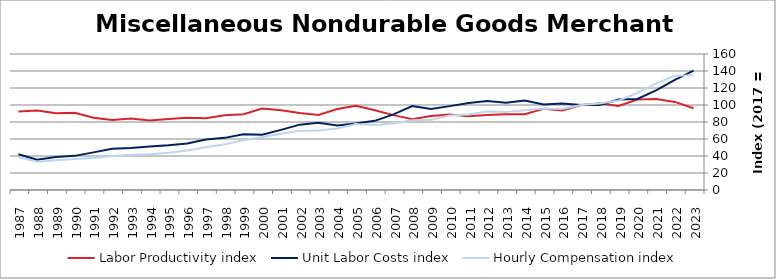
| Category | Labor Productivity index | Unit Labor Costs index | Hourly Compensation index |
|---|---|---|---|
| 2023.0 | 96.221 | 140.354 | 135.05 |
| 2022.0 | 103.648 | 129.61 | 134.338 |
| 2021.0 | 107.048 | 117.242 | 125.505 |
| 2020.0 | 106.496 | 107.169 | 114.13 |
| 2019.0 | 98.769 | 106.506 | 105.195 |
| 2018.0 | 101.631 | 100.028 | 101.66 |
| 2017.0 | 100 | 100 | 100 |
| 2016.0 | 93.65 | 101.788 | 95.324 |
| 2015.0 | 95.463 | 100.524 | 95.964 |
| 2014.0 | 89.197 | 105.195 | 93.83 |
| 2013.0 | 89.197 | 102.718 | 91.622 |
| 2012.0 | 88.104 | 104.779 | 92.315 |
| 2011.0 | 86.737 | 102.275 | 88.71 |
| 2010.0 | 88.768 | 98.663 | 87.581 |
| 2009.0 | 86.929 | 95.23 | 82.782 |
| 2008.0 | 83.142 | 98.813 | 82.155 |
| 2007.0 | 88.071 | 88.963 | 78.351 |
| 2006.0 | 93.893 | 81.348 | 76.38 |
| 2005.0 | 99.193 | 78.301 | 77.669 |
| 2004.0 | 95.365 | 75.931 | 72.412 |
| 2003.0 | 88.293 | 79.163 | 69.895 |
| 2002.0 | 90.6 | 76.889 | 69.661 |
| 2001.0 | 93.685 | 70.708 | 66.243 |
| 2000.0 | 95.774 | 65.003 | 62.256 |
| 1999.0 | 89.169 | 65.513 | 58.418 |
| 1998.0 | 87.823 | 61.328 | 53.86 |
| 1997.0 | 84.362 | 59.508 | 50.203 |
| 1996.0 | 84.89 | 54.836 | 46.55 |
| 1995.0 | 83.512 | 52.615 | 43.94 |
| 1994.0 | 81.744 | 51.289 | 41.926 |
| 1993.0 | 84.121 | 49.294 | 41.467 |
| 1992.0 | 82.413 | 48.563 | 40.022 |
| 1991.0 | 84.903 | 44.246 | 37.566 |
| 1990.0 | 90.938 | 40.158 | 36.519 |
| 1989.0 | 90.2 | 38.833 | 35.028 |
| 1988.0 | 93.585 | 35.534 | 33.254 |
| 1987.0 | 92.452 | 41.999 | 38.829 |